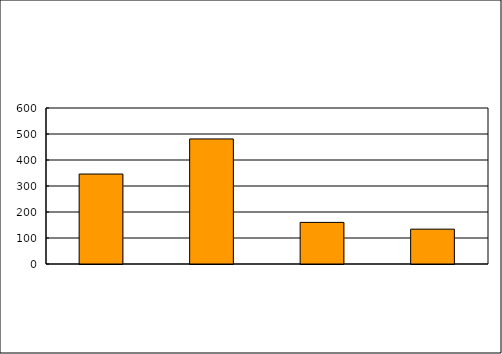
| Category | Series 0 |
|---|---|
| 0 | 346 |
| 1 | 481 |
| 2 | 160 |
| 3 | 134 |